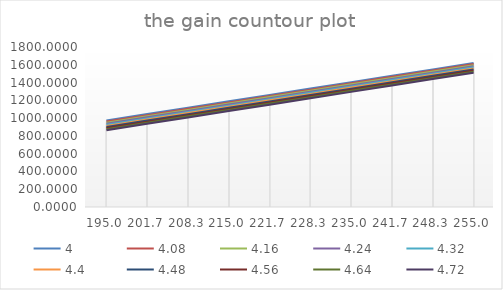
| Category | 4 | 4,08 | 4,16 | 4,24 | 4,32 | 4,4 | 4,48 | 4,56 | 4,64 | 4,72 |
|---|---|---|---|---|---|---|---|---|---|---|
| 195.0 | 973.4 | 961.228 | 949.056 | 936.884 | 924.712 | 912.54 | 900.368 | 888.196 | 876.024 | 863.852 |
| 201.66666666666666 | 1045.267 | 1033.095 | 1020.923 | 1008.751 | 996.579 | 984.407 | 972.235 | 960.063 | 947.891 | 935.719 |
| 208.33333333333331 | 1117.133 | 1104.961 | 1092.789 | 1080.617 | 1068.445 | 1056.273 | 1044.101 | 1031.929 | 1019.757 | 1007.585 |
| 214.99999999999997 | 1189 | 1176.828 | 1164.656 | 1152.484 | 1140.312 | 1128.14 | 1115.968 | 1103.796 | 1091.624 | 1079.452 |
| 221.66666666666663 | 1260.867 | 1248.695 | 1236.523 | 1224.351 | 1212.179 | 1200.007 | 1187.835 | 1175.663 | 1163.491 | 1151.319 |
| 228.3333333333333 | 1332.733 | 1320.561 | 1308.389 | 1296.217 | 1284.045 | 1271.873 | 1259.701 | 1247.529 | 1235.357 | 1223.185 |
| 234.99999999999994 | 1404.6 | 1392.428 | 1380.256 | 1368.084 | 1355.912 | 1343.74 | 1331.568 | 1319.396 | 1307.224 | 1295.052 |
| 241.6666666666666 | 1476.467 | 1464.295 | 1452.123 | 1439.951 | 1427.779 | 1415.607 | 1403.435 | 1391.263 | 1379.091 | 1366.919 |
| 248.33333333333326 | 1548.333 | 1536.161 | 1523.989 | 1511.817 | 1499.645 | 1487.473 | 1475.301 | 1463.129 | 1450.957 | 1438.785 |
| 254.99999999999991 | 1620.2 | 1608.028 | 1595.856 | 1583.684 | 1571.512 | 1559.34 | 1547.168 | 1534.996 | 1522.824 | 1510.652 |